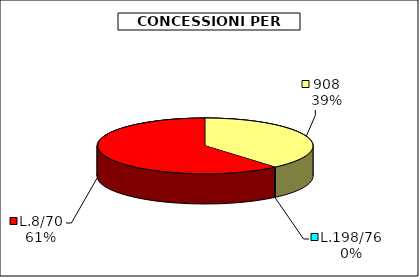
| Category | Series 0 |
|---|---|
| 908 | 68493.5 |
| L.198/76 | 227 |
| L.8/70 | 108085.85 |